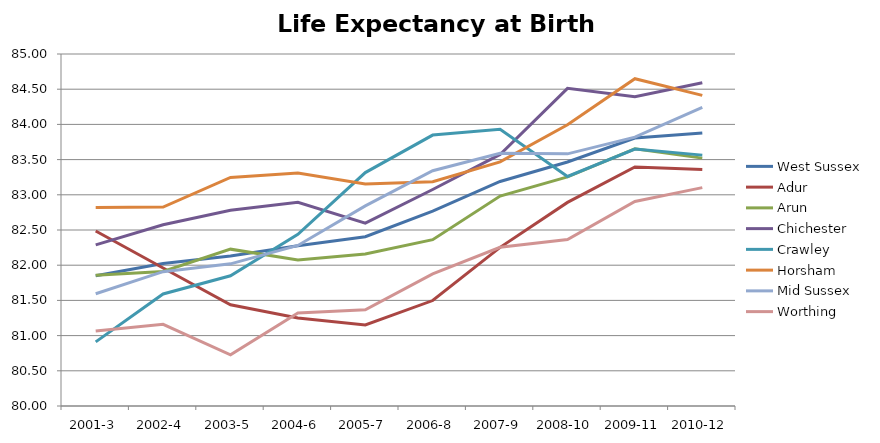
| Category | West Sussex | Adur | Arun | Chichester | Crawley | Horsham | Mid Sussex | Worthing |
|---|---|---|---|---|---|---|---|---|
| 2001-3 | 81.85 | 82.486 | 81.859 | 82.288 | 80.911 | 82.818 | 81.595 | 81.066 |
| 2002-4 | 82.024 | 81.96 | 81.911 | 82.575 | 81.591 | 82.826 | 81.908 | 81.16 |
| 2003-5 | 82.13 | 81.439 | 82.228 | 82.781 | 81.849 | 83.246 | 82.019 | 80.728 |
| 2004-6 | 82.278 | 81.251 | 82.073 | 82.895 | 82.439 | 83.309 | 82.281 | 81.321 |
| 2005-7 | 82.405 | 81.152 | 82.16 | 82.598 | 83.316 | 83.154 | 82.842 | 81.367 |
| 2006-8 | 82.769 | 81.498 | 82.362 | 83.076 | 83.848 | 83.186 | 83.341 | 81.877 |
| 2007-9 | 83.189 | 82.253 | 82.982 | 83.573 | 83.93 | 83.468 | 83.589 | 82.254 |
| 2008-10 | 83.467 | 82.892 | 83.254 | 84.512 | 83.26 | 83.995 | 83.582 | 82.364 |
| 2009-11 | 83.807 | 83.396 | 83.653 | 84.392 | 83.65 | 84.65 | 83.818 | 82.904 |
| 2010-12 | 83.879 | 83.358 | 83.521 | 84.591 | 83.564 | 84.412 | 84.242 | 83.102 |